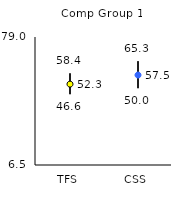
| Category | 25th | 75th | Mean |
|---|---|---|---|
| TFS | 46.6 | 58.4 | 52.31 |
| CSS | 50 | 65.3 | 57.46 |